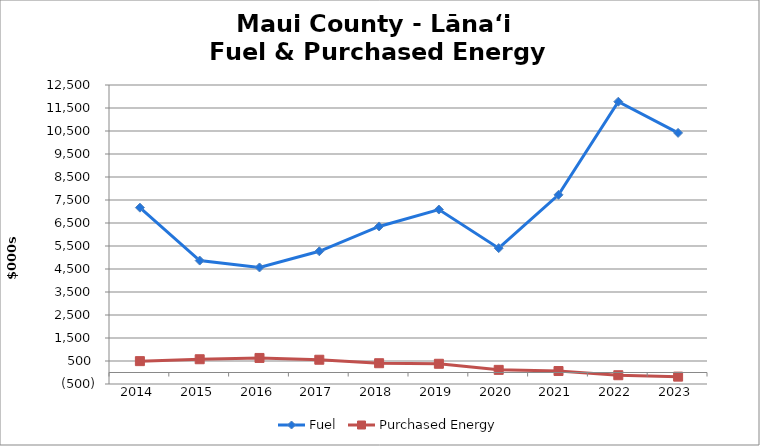
| Category | Fuel | Purchased Energy |
|---|---|---|
| 2014.0 | 7167.5 | 494 |
| 2015.0 | 4866.7 | 576.2 |
| 2016.0 | 4566 | 633 |
| 2017.0 | 5270.6 | 554.9 |
| 2018.0 | 6350.4 | 403 |
| 2019.0 | 7085.3 | 379.7 |
| 2020.0 | 5407 | 114.6 |
| 2021.0 | 7725.331 | 64.04 |
| 2022.0 | 11773.278 | -118.629 |
| 2023.0 | 10418.02 | -180 |